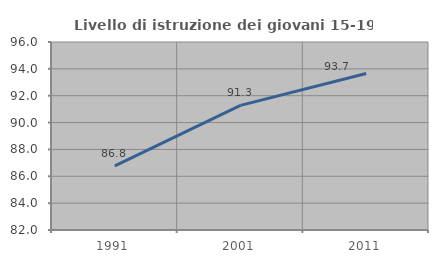
| Category | Livello di istruzione dei giovani 15-19 anni |
|---|---|
| 1991.0 | 86.779 |
| 2001.0 | 91.279 |
| 2011.0 | 93.657 |